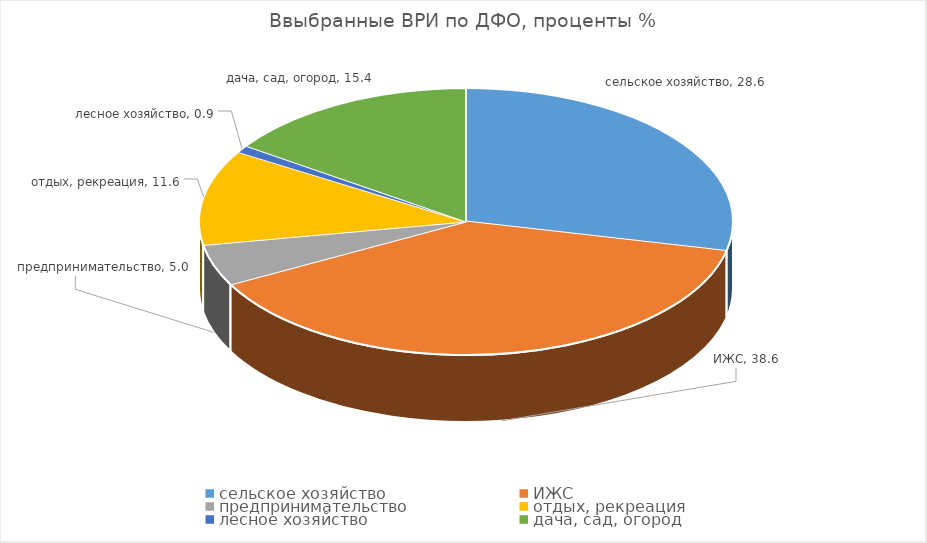
| Category | % |
|---|---|
| сельское хозяйство | 28.557 |
| ИЖС | 38.622 |
| предпринимательство | 4.998 |
| отдых, рекреация | 11.55 |
| лесное хозяйство | 0.875 |
| дача, сад, огород | 15.398 |